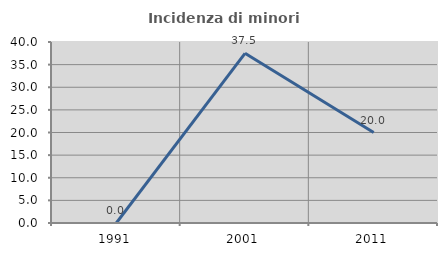
| Category | Incidenza di minori stranieri |
|---|---|
| 1991.0 | 0 |
| 2001.0 | 37.5 |
| 2011.0 | 20 |